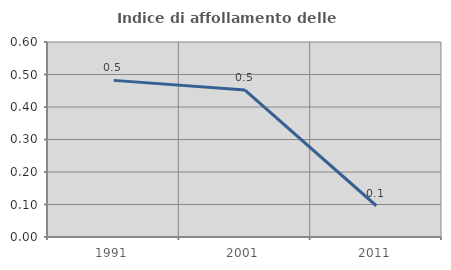
| Category | Indice di affollamento delle abitazioni  |
|---|---|
| 1991.0 | 0.482 |
| 2001.0 | 0.452 |
| 2011.0 | 0.096 |